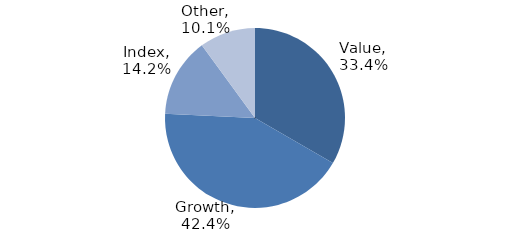
| Category | Investment Style |
|---|---|
| Value | 0.334 |
| Growth | 0.424 |
| Index | 0.142 |
| Other | 0.101 |